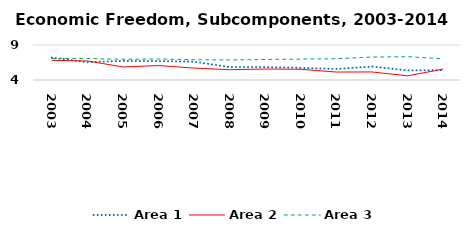
| Category | Area 1 | Area 2 | Area 3 |
|---|---|---|---|
| 2003.0 | 7.208 | 6.811 | 7.066 |
| 2004.0 | 6.539 | 6.719 | 7.069 |
| 2005.0 | 6.726 | 5.863 | 6.958 |
| 2006.0 | 6.696 | 6.063 | 6.999 |
| 2007.0 | 6.615 | 5.705 | 6.894 |
| 2008.0 | 5.842 | 5.469 | 6.87 |
| 2009.0 | 5.845 | 5.569 | 6.931 |
| 2010.0 | 5.737 | 5.532 | 6.985 |
| 2011.0 | 5.574 | 5.136 | 7.041 |
| 2012.0 | 5.922 | 5.148 | 7.275 |
| 2013.0 | 5.368 | 4.597 | 7.334 |
| 2014.0 | 5.399 | 5.56 | 7.022 |